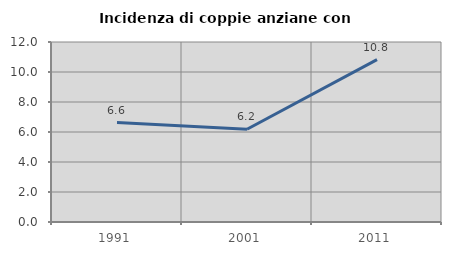
| Category | Incidenza di coppie anziane con figli |
|---|---|
| 1991.0 | 6.627 |
| 2001.0 | 6.181 |
| 2011.0 | 10.824 |